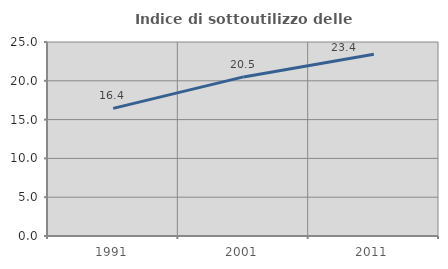
| Category | Indice di sottoutilizzo delle abitazioni  |
|---|---|
| 1991.0 | 16.444 |
| 2001.0 | 20.502 |
| 2011.0 | 23.412 |